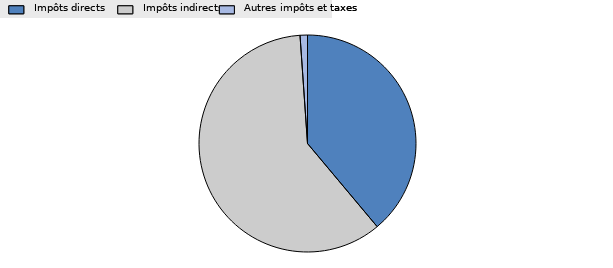
| Category | Series 0 |
|---|---|
| Impôts directs | 38.9 |
| Impôts indirects | 60 |
| Autres impôts et taxes | 1.1 |